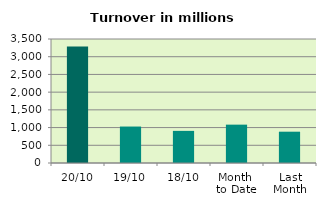
| Category | Series 0 |
|---|---|
| 20/10 | 3285.78 |
| 19/10 | 1029.012 |
| 18/10 | 906.749 |
| Month 
to Date | 1082.58 |
| Last
Month | 883.598 |